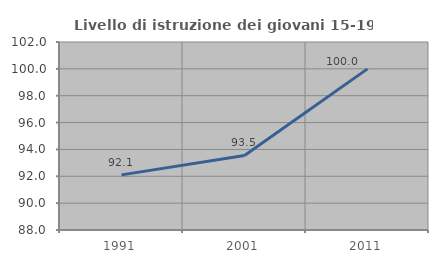
| Category | Livello di istruzione dei giovani 15-19 anni |
|---|---|
| 1991.0 | 92.105 |
| 2001.0 | 93.548 |
| 2011.0 | 100 |